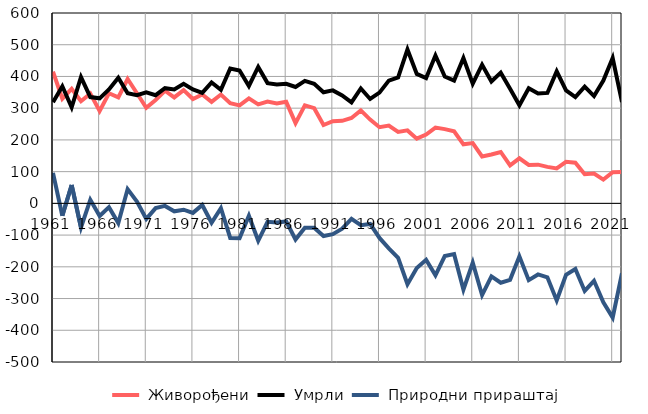
| Category |  Живорођени |  Умрли |  Природни прираштај |
|---|---|---|---|
| 1961.0 | 415 | 319 | 96 |
| 1962.0 | 330 | 369 | -39 |
| 1963.0 | 361 | 303 | 58 |
| 1964.0 | 322 | 398 | -76 |
| 1965.0 | 346 | 335 | 11 |
| 1966.0 | 291 | 331 | -40 |
| 1967.0 | 347 | 359 | -12 |
| 1968.0 | 334 | 396 | -62 |
| 1969.0 | 392 | 347 | 45 |
| 1970.0 | 347 | 341 | 6 |
| 1971.0 | 301 | 350 | -49 |
| 1972.0 | 326 | 341 | -15 |
| 1973.0 | 355 | 363 | -8 |
| 1974.0 | 334 | 359 | -25 |
| 1975.0 | 357 | 377 | -20 |
| 1976.0 | 329 | 359 | -30 |
| 1977.0 | 343 | 348 | -5 |
| 1978.0 | 320 | 381 | -61 |
| 1979.0 | 343 | 358 | -15 |
| 1980.0 | 316 | 425 | -109 |
| 1981.0 | 309 | 419 | -110 |
| 1982.0 | 331 | 370 | -39 |
| 1983.0 | 312 | 430 | -118 |
| 1984.0 | 321 | 379 | -58 |
| 1985.0 | 315 | 375 | -60 |
| 1986.0 | 320 | 377 | -57 |
| 1987.0 | 253 | 367 | -114 |
| 1988.0 | 309 | 386 | -77 |
| 1989.0 | 300 | 377 | -77 |
| 1990.0 | 247 | 350 | -103 |
| 1991.0 | 259 | 356 | -97 |
| 1992.0 | 260 | 340 | -80 |
| 1993.0 | 269 | 318 | -49 |
| 1994.0 | 293 | 362 | -69 |
| 1995.0 | 264 | 329 | -65 |
| 1996.0 | 240 | 349 | -109 |
| 1997.0 | 245 | 387 | -142 |
| 1998.0 | 225 | 397 | -172 |
| 1999.0 | 230 | 485 | -255 |
| 2000.0 | 204 | 408 | -204 |
| 2001.0 | 217 | 395 | -178 |
| 2002.0 | 239 | 466 | -227 |
| 2003.0 | 234 | 400 | -166 |
| 2004.0 | 227 | 387 | -160 |
| 2005.0 | 186 | 458 | -272 |
| 2006.0 | 190 | 377 | -187 |
| 2007.0 | 148 | 437 | -289 |
| 2008.0 | 154 | 384 | -230 |
| 2009.0 | 162 | 412 | -250 |
| 2010.0 | 120 | 361 | -241 |
| 2011.0 | 142 | 309 | -167 |
| 2012.0 | 121 | 363 | -242 |
| 2013.0 | 122 | 346 | -224 |
| 2014.0 | 115 | 348 | -233 |
| 2015.0 | 110 | 416 | -306 |
| 2016.0 | 131 | 356 | -225 |
| 2017.0 | 128 | 335 | -207 |
| 2018.0 | 92 | 368 | -276 |
| 2019.0 | 94 | 338 | -244 |
| 2020.0 | 75 | 387 | -312 |
| 2021.0 | 98 | 458 | -360 |
| 2022.0 | 99 | 319 | -220 |